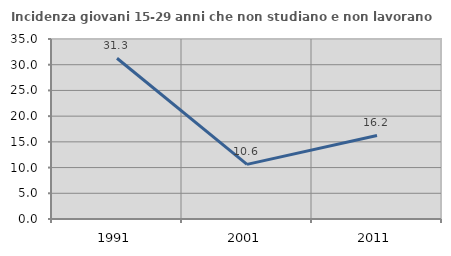
| Category | Incidenza giovani 15-29 anni che non studiano e non lavorano  |
|---|---|
| 1991.0 | 31.25 |
| 2001.0 | 10.626 |
| 2011.0 | 16.238 |